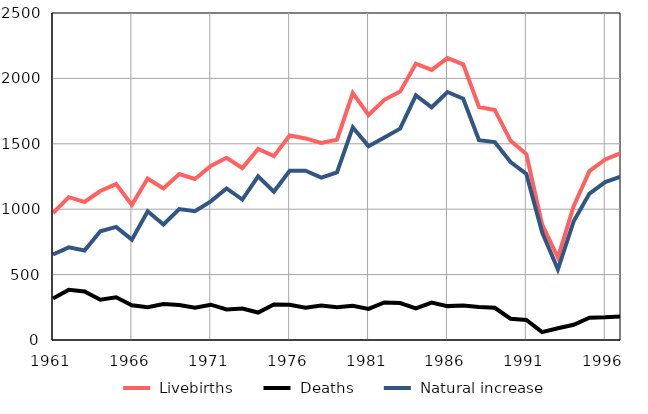
| Category |  Livebirths |  Deaths |  Natural increase |
|---|---|---|---|
| 1961.0 | 971 | 317 | 654 |
| 1962.0 | 1092 | 384 | 708 |
| 1963.0 | 1055 | 371 | 684 |
| 1964.0 | 1139 | 308 | 831 |
| 1965.0 | 1192 | 327 | 865 |
| 1966.0 | 1033 | 266 | 767 |
| 1967.0 | 1235 | 251 | 984 |
| 1968.0 | 1158 | 275 | 883 |
| 1969.0 | 1269 | 268 | 1001 |
| 1970.0 | 1231 | 246 | 985 |
| 1971.0 | 1330 | 270 | 1060 |
| 1972.0 | 1393 | 234 | 1159 |
| 1973.0 | 1315 | 241 | 1074 |
| 1974.0 | 1461 | 210 | 1251 |
| 1975.0 | 1406 | 272 | 1134 |
| 1976.0 | 1563 | 269 | 1294 |
| 1977.0 | 1541 | 247 | 1294 |
| 1978.0 | 1506 | 264 | 1242 |
| 1979.0 | 1531 | 250 | 1281 |
| 1980.0 | 1887 | 262 | 1625 |
| 1981.0 | 1720 | 238 | 1482 |
| 1982.0 | 1836 | 287 | 1549 |
| 1983.0 | 1899 | 283 | 1616 |
| 1984.0 | 2112 | 242 | 1870 |
| 1985.0 | 2065 | 286 | 1779 |
| 1986.0 | 2155 | 259 | 1896 |
| 1987.0 | 2108 | 263 | 1845 |
| 1988.0 | 1781 | 253 | 1528 |
| 1989.0 | 1759 | 246 | 1513 |
| 1990.0 | 1524 | 163 | 1361 |
| 1991.0 | 1422 | 153 | 1269 |
| 1992.0 | 884 | 60 | 824 |
| 1993.0 | 630 | 90 | 540 |
| 1994.0 | 1023 | 116 | 907 |
| 1995.0 | 1291 | 171 | 1120 |
| 1996.0 | 1380 | 173 | 1207 |
| 1997.0 | 1429 | 180 | 1249 |